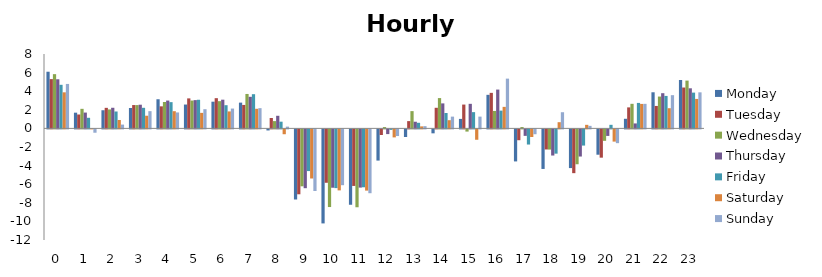
| Category | Monday | Tuesday | Wednesday | Thursday | Friday | Saturday | Sunday |
|---|---|---|---|---|---|---|---|
| 0.0 | 6.094 | 5.299 | 5.833 | 5.283 | 4.688 | 3.879 | 4.78 |
| 1.0 | 1.691 | 1.494 | 2.104 | 1.702 | 1.141 | 0.005 | -0.358 |
| 2.0 | 1.953 | 2.21 | 2.037 | 2.219 | 1.818 | 0.902 | 0.41 |
| 3.0 | 2.194 | 2.511 | 2.505 | 2.548 | 2.215 | 1.363 | 1.854 |
| 4.0 | 3.134 | 2.372 | 2.839 | 2.994 | 2.823 | 1.85 | 1.715 |
| 5.0 | 2.566 | 3.227 | 2.995 | 3.041 | 3.08 | 1.671 | 2.064 |
| 6.0 | 2.872 | 3.25 | 2.928 | 3.088 | 2.496 | 1.824 | 2.134 |
| 7.0 | 2.772 | 2.524 | 3.703 | 3.397 | 3.678 | 2.108 | 2.177 |
| 8.0 | -0.112 | 1.12 | 0.784 | 1.356 | 0.722 | -0.519 | 0.191 |
| 9.0 | -7.537 | -6.977 | -6.118 | -6.322 | -4.482 | -5.278 | -6.625 |
| 10.0 | -10.109 | -5.739 | -8.348 | -6.272 | -6.313 | -6.557 | -5.999 |
| 11.0 | -8.103 | -6.079 | -8.372 | -6.258 | -6.224 | -6.582 | -6.863 |
| 12.0 | -3.353 | -0.603 | 0.144 | -0.505 | -0.051 | -0.859 | -0.713 |
| 13.0 | -0.815 | 0.784 | 1.858 | 0.716 | 0.604 | 0.217 | 0.242 |
| 14.0 | -0.422 | 2.216 | 3.26 | 2.689 | 1.655 | 0.883 | 1.267 |
| 15.0 | 1.022 | 2.563 | -0.235 | 2.642 | 1.748 | -1.115 | 1.267 |
| 16.0 | 3.61 | 3.822 | 1.874 | 4.175 | 1.911 | 2.316 | 5.352 |
| 17.0 | -3.444 | -1.163 | 0.147 | -0.696 | -1.627 | -0.819 | -0.52 |
| 18.0 | -4.253 | -2.157 | -2.169 | -2.809 | -2.608 | 0.667 | 1.739 |
| 19.0 | -4.159 | -4.705 | -3.748 | -2.917 | -1.739 | 0.384 | 0.274 |
| 20.0 | -2.722 | -3.039 | -1.229 | -0.701 | 0.385 | -1.313 | -1.48 |
| 21.0 | 1.035 | 2.259 | 2.643 | 0.534 | 2.74 | 2.633 | 2.641 |
| 22.0 | 3.884 | 2.415 | 3.424 | 3.785 | 3.493 | 2.171 | 3.574 |
| 23.0 | 5.203 | 4.395 | 5.14 | 4.312 | 3.848 | 3.169 | 3.878 |